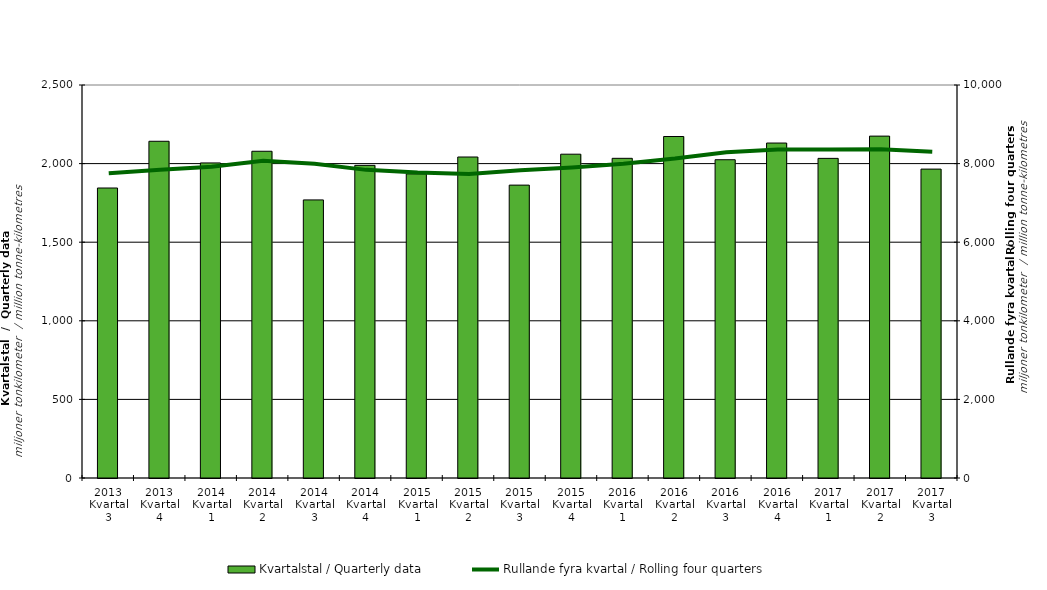
| Category | Kvartalstal / Quarterly data |
|---|---|
| 2013 Kvartal 3 | 1844.768 |
| 2013 Kvartal 4 | 2142.032 |
| 2014 Kvartal 1 | 2004.251 |
| 2014 Kvartal 2 | 2078.529 |
| 2014 Kvartal 3 | 1768.998 |
| 2014 Kvartal 4 | 1988.83 |
| 2015 Kvartal 1 | 1934.598 |
| 2015 Kvartal 2 | 2041.891 |
| 2015 Kvartal 3 | 1863.08 |
| 2015 Kvartal 4 | 2059.851 |
| 2016 Kvartal 1 | 2033.587 |
| 2016 Kvartal 2 | 2172.381 |
| 2016 Kvartal 3 | 2024.615 |
| 2016 Kvartal 4 | 2130.769 |
| 2017 Kvartal 1 | 2033.252 |
| 2017 Kvartal 2 | 2174.789 |
| 2017 Kvartal 3 | 1965.019 |